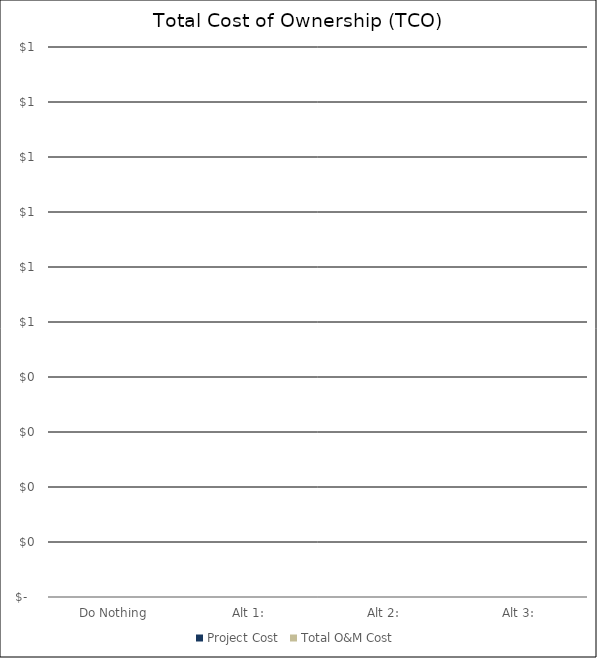
| Category |  Project Cost  |  O&M: FTE IT staff  |  O&M: FTE operations staff  |  O&M: Ops Contractors  |  O&M: IT Vendor Svcs.  |  O&M: SW & Licenses  |  O&M: HW  |  O&M: Maintenance  |  O&M: Facilities  |  O&M: Telecomm  |  O&M: Training  |  O&M: Op Contingncy  |  O&M: Misc Ops  |  Total O&M Cost  |
|---|---|---|---|---|---|---|---|---|---|---|---|---|---|---|
|  Do Nothing  | 0 |  |  |  |  |  |  |  |  |  |  |  |  | 0 |
|  Alt 1:  | 0 |  |  |  |  |  |  |  |  |  |  |  |  | 0 |
|  Alt 2:  | 0 |  |  |  |  |  |  |  |  |  |  |  |  | 0 |
|  Alt 3:  | 0 |  |  |  |  |  |  |  |  |  |  |  |  | 0 |